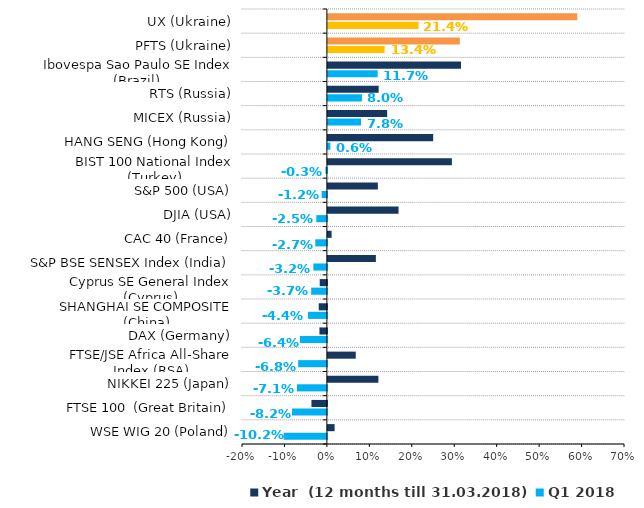
| Category | Q1 2018 | Year  (12 months till 31.03.2018) |
|---|---|---|
| WSE WIG 20 (Poland) | -0.102 | 0.016 |
| FTSE 100  (Great Britain) | -0.082 | -0.036 |
| NIKKEI 225 (Japan) | -0.071 | 0.119 |
| FTSE/JSE Africa All-Share Index (RSA) | -0.068 | 0.066 |
| DAX (Germany) | -0.064 | -0.018 |
| SHANGHAI SE COMPOSITE (China) | -0.044 | -0.019 |
| Cyprus SE General Index (Cyprus) | -0.037 | -0.017 |
| S&P BSE SENSEX Index (India) | -0.032 | 0.113 |
| CAC 40 (France) | -0.027 | 0.009 |
| DJIA (USA) | -0.025 | 0.166 |
| S&P 500 (USA) | -0.012 | 0.118 |
| BIST 100 National Index (Тurkey) | -0.003 | 0.292 |
| HANG SENG (Hong Kong) | 0.006 | 0.248 |
| МICEX (Russia) | 0.078 | 0.14 |
| RTS (Russia) | 0.08 | 0.12 |
| Ibovespa Sao Paulo SE Index (Brazil)  | 0.117 | 0.314 |
| PFTS (Ukraine) | 0.134 | 0.311 |
| UX (Ukraine) | 0.214 | 0.588 |